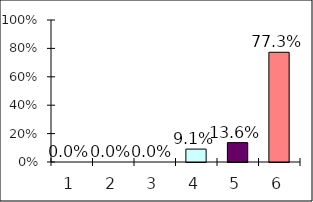
| Category | Series 0 |
|---|---|
| 0 | 0 |
| 1 | 0 |
| 2 | 0 |
| 3 | 0.091 |
| 4 | 0.136 |
| 5 | 0.773 |